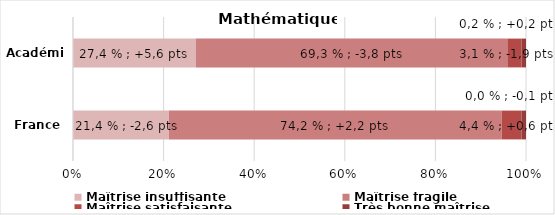
| Category | Maîtrise insuffisante | Maîtrise fragile | Maîtrise satisfaisante | Très bonne maîtrise |
|---|---|---|---|---|
| France | 21.375 | 74.215 | 4.396 | 1 |
| Académie | 27.357 | 69.316 | 3.142 | 1 |